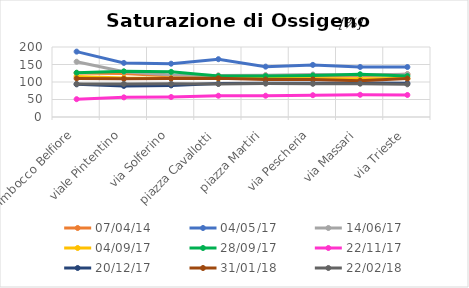
| Category | 07/04/14 | 04/05/17 | 14/06/17 | 04/09/17 | 28/09/17 | 22/11/17 | 20/12/17 | 31/01/18 | 22/02/18 |
|---|---|---|---|---|---|---|---|---|---|
| Imbocco Belfiore | 126 | 186.8 | 157.9 | 116 | 126.5 | 50.9 | 93.3 | 110 | 94.4 |
| viale Pintentino | 124.5 | 154.5 | 129.6 | 111.3 | 130.4 | 56.1 | 88.8 | 109.2 | 94.6 |
| via Solferino | 117.4 | 152.3 | 120.3 | 110.4 | 129 | 57.1 | 90.3 | 109.8 | 94.9 |
| piazza Cavallotti | 118.1 | 165.2 | 118.5 | 109.9 | 117 | 60.8 | 95.5 | 110.6 | 94.3 |
| piazza Martiri | 118.9 | 143.9 | 119.4 | 110.6 | 116.8 | 60.8 | 96.7 | 107 | 95.5 |
| via Pescheria | 116.4 | 148.9 | 121.5 | 109 | 118.5 | 62.3 | 96.6 | 107.4 | 94.9 |
| via Massari | 117.7 | 142.9 | 119.8 | 109.6 | 122.1 | 63.5 | 97.4 | 103.4 | 95.2 |
| via Trieste | 122 | 142.8 | 122.4 | 109.9 | 117 | 62.9 | 96.5 | 109.8 | 93.4 |